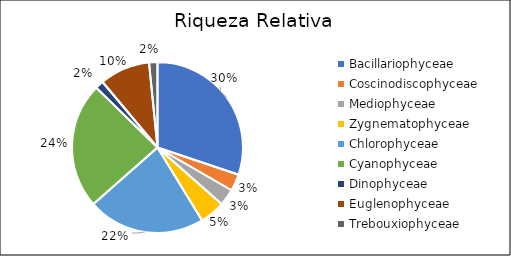
| Category | Series 0 |
|---|---|
| Bacillariophyceae | 0.302 |
| Coscinodiscophyceae | 0.032 |
| Mediophyceae | 0.032 |
| Zygnematophyceae | 0.048 |
| Chlorophyceae | 0.222 |
| Cyanophyceae | 0.238 |
| Dinophyceae | 0.016 |
| Euglenophyceae | 0.095 |
| Trebouxiophyceae | 0.016 |